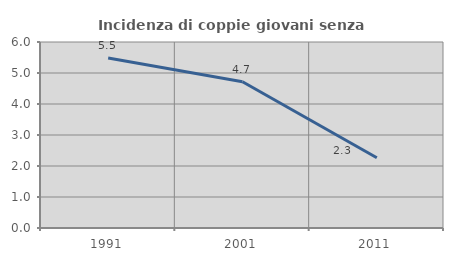
| Category | Incidenza di coppie giovani senza figli |
|---|---|
| 1991.0 | 5.481 |
| 2001.0 | 4.718 |
| 2011.0 | 2.268 |